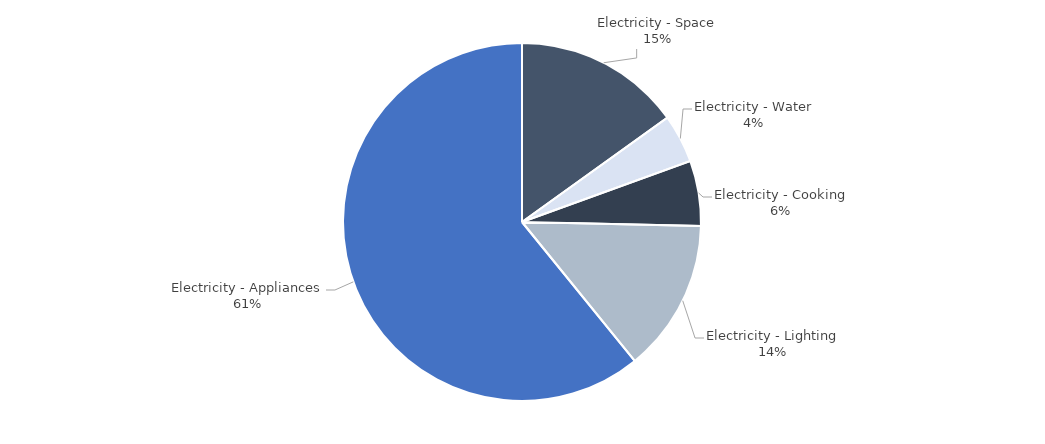
| Category | Series 0 |
|---|---|
| Electricity - Space | 1400.945 |
| Electricity - Water | 406.16 |
| Electricity - Cooking | 546.428 |
| Electricity - Lighting | 1280.861 |
| Electricity - Appliances | 5649.246 |